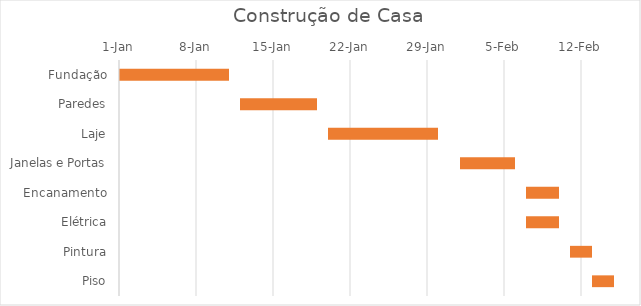
| Category | Data início | Duração |
|---|---|---|
| Fundação | 2018-01-01 | 10 |
| Paredes | 2018-01-12 | 7 |
| Laje | 2018-01-20 | 10 |
| Janelas e Portas | 2018-02-01 | 5 |
| Encanamento | 2018-02-07 | 3 |
| Elétrica | 2018-02-07 | 3 |
| Pintura | 2018-02-11 | 2 |
| Piso | 2018-02-13 | 2 |